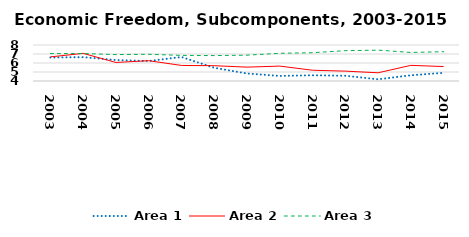
| Category | Area 1 | Area 2 | Area 3 |
|---|---|---|---|
| 2003.0 | 6.609 | 6.68 | 7.049 |
| 2004.0 | 6.65 | 7.069 | 7.051 |
| 2005.0 | 6.327 | 6.061 | 6.935 |
| 2006.0 | 6.218 | 6.256 | 6.968 |
| 2007.0 | 6.666 | 5.728 | 6.846 |
| 2008.0 | 5.468 | 5.701 | 6.825 |
| 2009.0 | 4.834 | 5.541 | 6.87 |
| 2010.0 | 4.56 | 5.656 | 7.079 |
| 2011.0 | 4.637 | 5.195 | 7.143 |
| 2012.0 | 4.581 | 5.097 | 7.372 |
| 2013.0 | 4.189 | 4.912 | 7.429 |
| 2014.0 | 4.637 | 5.738 | 7.172 |
| 2015.0 | 4.908 | 5.603 | 7.255 |